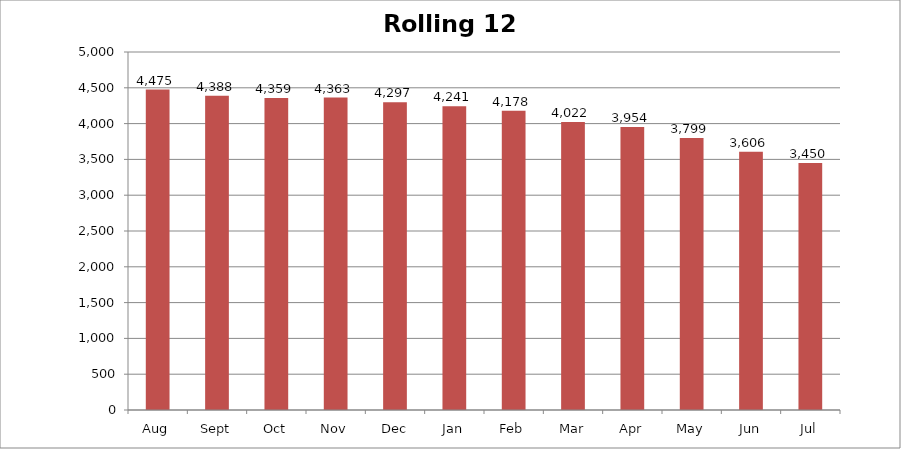
| Category | Rolling 12 Month |
|---|---|
| Aug | 4475 |
| Sept | 4388 |
| Oct | 4359 |
| Nov | 4363 |
| Dec | 4297 |
| Jan | 4241 |
| Feb | 4178 |
| Mar | 4022 |
| Apr | 3954 |
| May | 3799 |
| Jun | 3606 |
| Jul | 3450 |